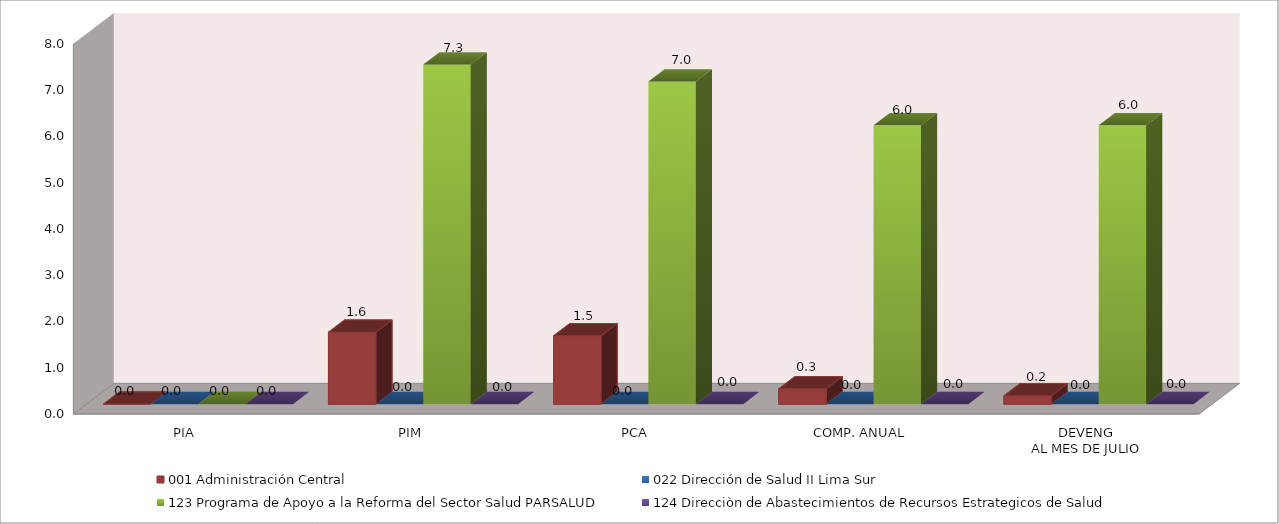
| Category | 001 Administración Central | 022 Dirección de Salud II Lima Sur | 123 Programa de Apoyo a la Reforma del Sector Salud PARSALUD | 124 Direcciòn de Abastecimientos de Recursos Estrategicos de Salud |
|---|---|---|---|---|
| PIA | 0 | 0 | 0 | 0 |
| PIM | 1.554 | 0.005 | 7.334 | 0 |
| PCA | 1.476 | 0.005 | 6.968 | 0 |
| COMP. ANUAL | 0.331 | 0.005 | 6.026 | 0 |
| DEVENG
AL MES DE JULIO | 0.18 | 0 | 6.026 | 0 |